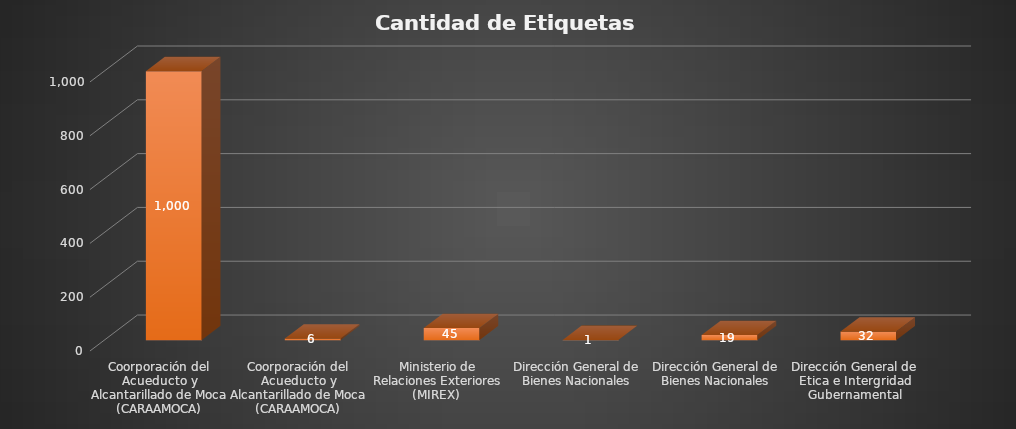
| Category | Cantidad de Etiquetas Entregadas |
|---|---|
| Coorporación del Acueducto y Alcantarillado de Moca (CARAAMOCA) | 1000 |
| Coorporación del Acueducto y Alcantarillado de Moca (CARAAMOCA) | 6 |
| Ministerio de Relaciones Exteriores (MIREX)  | 45 |
| Dirección General de Bienes Nacionales | 1 |
| Dirección General de Bienes Nacionales | 19 |
| Dirección General de Etica e Intergridad Gubernamental | 32 |